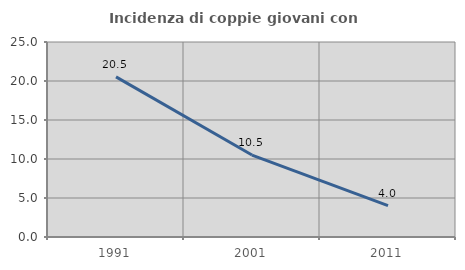
| Category | Incidenza di coppie giovani con figli |
|---|---|
| 1991.0 | 20.532 |
| 2001.0 | 10.508 |
| 2011.0 | 4.013 |